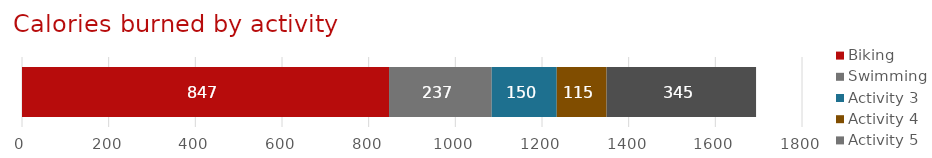
| Category | Biking | Swimming | Activity 3 | Activity 4 | Activity 5 |
|---|---|---|---|---|---|
| Activity tracker | 847 | 237 | 150 | 115 | 345 |